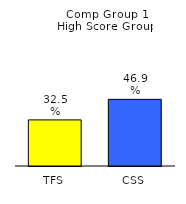
| Category | Series 0 |
|---|---|
| TFS | 0.325 |
| CSS | 0.469 |